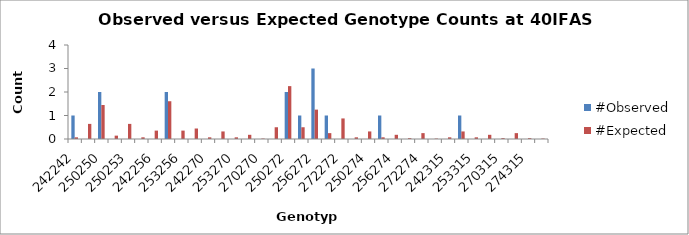
| Category | #Observed | #Expected |
|---|---|---|
| 242242.0 | 1 | 0.071 |
| 242250.0 | 0 | 0.643 |
| 250250.0 | 2 | 1.446 |
| 242253.0 | 0 | 0.143 |
| 250253.0 | 0 | 0.643 |
| 253253.0 | 0 | 0.071 |
| 242256.0 | 0 | 0.357 |
| 250256.0 | 2 | 1.607 |
| 253256.0 | 0 | 0.357 |
| 256256.0 | 0 | 0.446 |
| 242270.0 | 0 | 0.071 |
| 250270.0 | 0 | 0.321 |
| 253270.0 | 0 | 0.071 |
| 256270.0 | 0 | 0.179 |
| 270270.0 | 0 | 0.018 |
| 242272.0 | 0 | 0.5 |
| 250272.0 | 2 | 2.25 |
| 253272.0 | 1 | 0.5 |
| 256272.0 | 3 | 1.25 |
| 270272.0 | 1 | 0.25 |
| 272272.0 | 0 | 0.875 |
| 242274.0 | 0 | 0.071 |
| 250274.0 | 0 | 0.321 |
| 253274.0 | 1 | 0.071 |
| 256274.0 | 0 | 0.179 |
| 270274.0 | 0 | 0.036 |
| 272274.0 | 0 | 0.25 |
| 274274.0 | 0 | 0.018 |
| 242315.0 | 0 | 0.071 |
| 250315.0 | 1 | 0.321 |
| 253315.0 | 0 | 0.071 |
| 256315.0 | 0 | 0.179 |
| 270315.0 | 0 | 0.036 |
| 272315.0 | 0 | 0.25 |
| 274315.0 | 0 | 0.036 |
| 315315.0 | 0 | 0.018 |